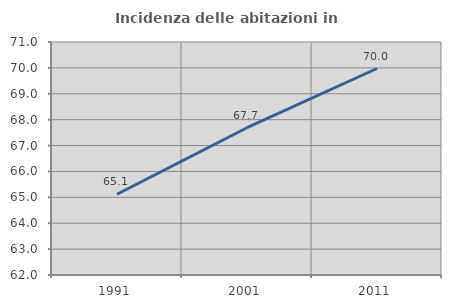
| Category | Incidenza delle abitazioni in proprietà  |
|---|---|
| 1991.0 | 65.118 |
| 2001.0 | 67.689 |
| 2011.0 | 69.976 |